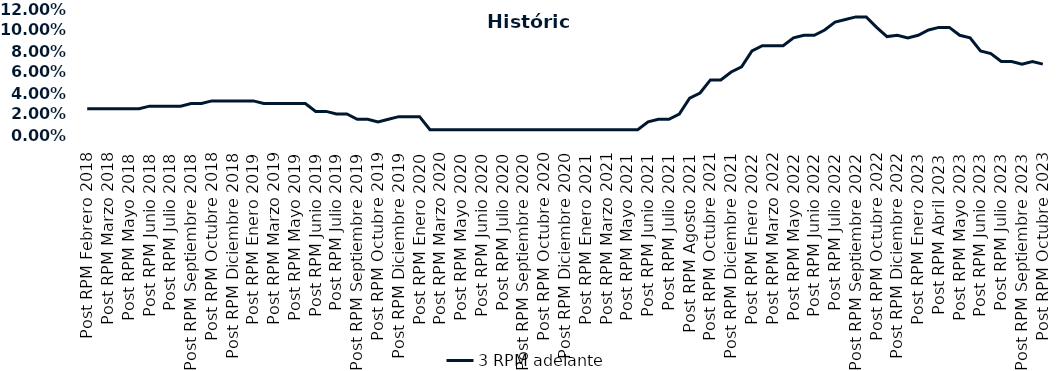
| Category | 3 RPM adelante |
|---|---|
| Post RPM Febrero 2018 | 0.025 |
| Pre RPM Marzo 2018 | 0.025 |
| Post RPM Marzo 2018 | 0.025 |
| Pre RPM Mayo 2018 | 0.025 |
| Post RPM Mayo 2018 | 0.025 |
| Pre RPM Junio 2018 | 0.025 |
| Post RPM Junio 2018 | 0.028 |
| Pre RPM Julio 2018 | 0.028 |
| Post RPM Julio 2018 | 0.028 |
| Pre RPM Septiembre 2018 | 0.028 |
| Post RPM Septiembre 2018 | 0.03 |
| Pre RPM Octubre 2018 | 0.03 |
| Post RPM Octubre 2018 | 0.032 |
| Pre RPM Diciembre 2018 | 0.032 |
| Post RPM Diciembre 2018 | 0.032 |
| Pre RPM Enero 2019 | 0.032 |
| Post RPM Enero 2019 | 0.032 |
| Pre RPM Marzo 2019 | 0.03 |
| Post RPM Marzo 2019 | 0.03 |
| Pre RPM Mayo 2019 | 0.03 |
| Post RPM Mayo 2019 | 0.03 |
| Pre RPM Junio 2019 | 0.03 |
| Post RPM Junio 2019 | 0.022 |
| Pre RPM Julio 2019 | 0.022 |
| Post RPM Julio 2019 | 0.02 |
| Pre RPM Septiembre 2019 | 0.02 |
| Post RPM Septiembre 2019 | 0.015 |
| Pre RPM Octubre 2019 | 0.015 |
| Post RPM Octubre 2019 | 0.012 |
| Pre RPM Diciembre 2019 | 0.015 |
| Post RPM Diciembre 2019 | 0.018 |
| Pre RPM Enero 2020 | 0.018 |
| Post RPM Enero 2020 | 0.018 |
| Pre RPM Marzo 2020 | 0.005 |
| Post RPM Marzo 2020 | 0.005 |
| Pre RPM Mayo 2020 | 0.005 |
| Post RPM Mayo 2020 | 0.005 |
| Pre RPM Junio 2020 | 0.005 |
| Post RPM Junio 2020 | 0.005 |
| Pre RPM Julio 2020 | 0.005 |
| Post RPM Julio 2020 | 0.005 |
| Pre RPM Septiembre 2020 | 0.005 |
| Post RPM Septiembre 2020 | 0.005 |
| Pre RPM Octubre 2020 | 0.005 |
| Post RPM Octubre 2020 | 0.005 |
| Pre RPM Diciembre 2020 | 0.005 |
| Post RPM Diciembre 2020 | 0.005 |
| Pre RPM Enero 2021 | 0.005 |
| Post RPM Enero 2021 | 0.005 |
| Pre RPM Marzo 2021 | 0.005 |
| Post RPM Marzo 2021 | 0.005 |
| Pre RPM Mayo 2021 | 0.005 |
| Post RPM Mayo 2021 | 0.005 |
| Pre RPM Junio 2021 | 0.005 |
| Post RPM Junio 2021 | 0.012 |
| Pre RPM Julio 2021 | 0.015 |
| Post RPM Julio 2021 | 0.015 |
| Pre RPM Agosto 2021 | 0.02 |
| Post RPM Agosto 2021 | 0.035 |
| Pre RPM Octubre 2021 | 0.04 |
| Post RPM Octubre 2021 | 0.052 |
| Pre RPM Diciembre 2021 | 0.052 |
| Post RPM Diciembre 2021 | 0.06 |
| Pre RPM Enero 2022 | 0.065 |
| Post RPM Enero 2022 | 0.08 |
| Pre RPM Marzo 2022 | 0.085 |
| Post RPM Marzo 2022 | 0.085 |
| Pre RPM Mayo 2022 | 0.085 |
| Post RPM Mayo 2022 | 0.092 |
| Pre RPM Junio 2022 | 0.095 |
| Post RPM Junio 2022 | 0.095 |
| Pre RPM Julio 2022 | 0.1 |
| Post RPM Julio 2022 | 0.108 |
| Pre RPM Septiembre 2022 | 0.11 |
| Post RPM Septiembre 2022 | 0.112 |
| Pre RPM Octubre 2022 | 0.112 |
| Post RPM Octubre 2022 | 0.102 |
| Pre RPM Diciembre 2022 | 0.094 |
| Post RPM Diciembre 2022 | 0.095 |
| Pre RPM Enero 2023 | 0.092 |
| Post RPM Enero 2023 | 0.095 |
| Pre RPM Abril 2023 | 0.1 |
| Post RPM Abril 2023 | 0.102 |
| Pre RPM Mayo 2023 | 0.102 |
| Post RPM Mayo 2023 | 0.095 |
| Pre RPM Junio 2023 | 0.092 |
| Post RPM Junio 2023 | 0.08 |
| Pre RPM Julio 2023 | 0.078 |
| Post RPM Julio 2023 | 0.07 |
| Pre RPM Septiembre 2023 | 0.07 |
| Post RPM Septiembre 2023 | 0.068 |
| Pre RPM Octubre 2023 | 0.07 |
| Post RPM Octubre 2023 | 0.068 |